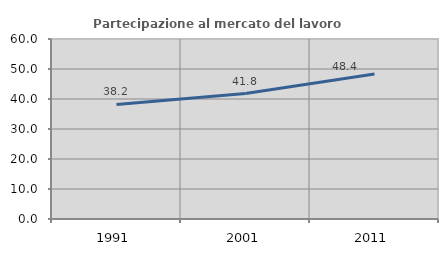
| Category | Partecipazione al mercato del lavoro  femminile |
|---|---|
| 1991.0 | 38.172 |
| 2001.0 | 41.817 |
| 2011.0 | 48.355 |